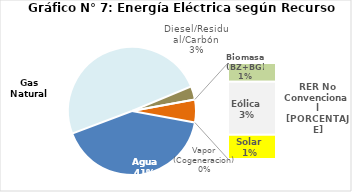
| Category | Series 0 |
|---|---|
| Agua | 1904.734 |
| Gas Natural | 2280.576 |
| Diesel/Residual/Carbón | 154.498 |
| Vapor (Cogeneracion) | 0.382 |
| Biomasa (BZ+BG) | 52.378 |
| Eólica | 147.804 |
| Solar | 67.235 |